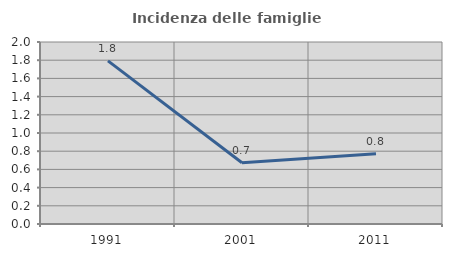
| Category | Incidenza delle famiglie numerose |
|---|---|
| 1991.0 | 1.792 |
| 2001.0 | 0.673 |
| 2011.0 | 0.773 |